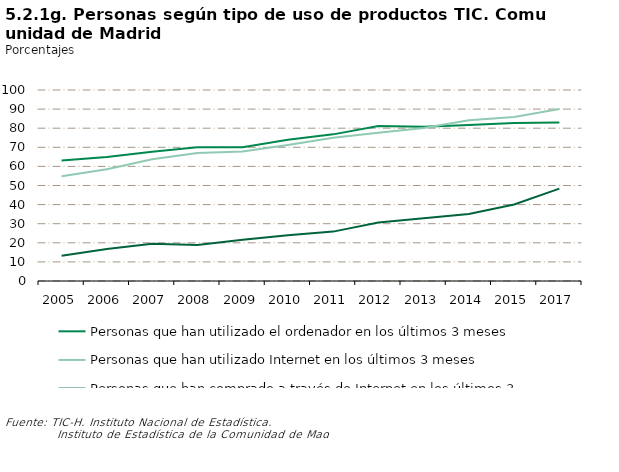
| Category | Personas que han utilizado el ordenador en los últimos 3 meses | Personas que han utilizado Internet en los últimos 3 meses | Personas que han comprado a través de Internet en los últimos 3 meses |
|---|---|---|---|
| 2005.0 | 63.101 | 54.897 | 13.253 |
| 2006.0 | 64.983 | 58.563 | 16.796 |
| 2007.0 | 67.717 | 63.787 | 19.491 |
| 2008.0 | 70.018 | 67.009 | 18.796 |
| 2009.0 | 70.055 | 67.82 | 21.656 |
| 2010.0 | 73.967 | 71.257 | 23.981 |
| 2011.0 | 76.771 | 75.03 | 25.861 |
| 2012.0 | 81.167 | 77.661 | 30.675 |
| 2013.0 | 80.7 | 80.1 | 32.8 |
| 2014.0 | 81.734 | 84.191 | 35.065 |
| 2015.0 | 82.68 | 85.864 | 40.072 |
| 2017.0 | 82.958 | 90.049 | 48.338 |